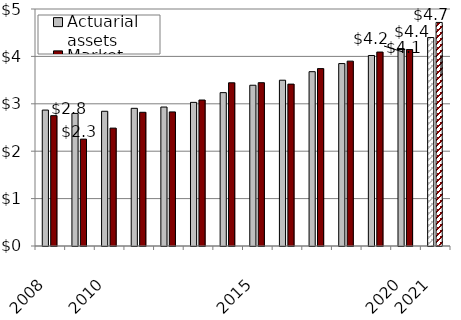
| Category | Actuarial assets | Market assets |
|---|---|---|
| 2008.0 | 2.868 | 2.75 |
| nan | 2.797 | 2.255 |
| 2010.0 | 2.842 | 2.487 |
| nan | 2.905 | 2.821 |
| nan | 2.932 | 2.829 |
| nan | 3.03 | 3.08 |
| nan | 3.236 | 3.443 |
| 2015.0 | 3.391 | 3.445 |
| nan | 3.498 | 3.415 |
| nan | 3.678 | 3.742 |
| nan | 3.849 | 3.9 |
| nan | 4.019 | 4.092 |
| 2020.0 | 4.165 | 4.144 |
| 2021.0 | 4.398 | 4.717 |